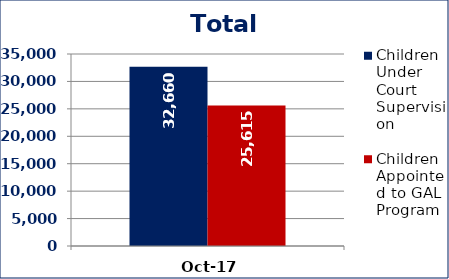
| Category | Children Under Court Supervision  | Children Appointed to GAL Program  |
|---|---|---|
| Oct-17 | 32660 | 25615 |